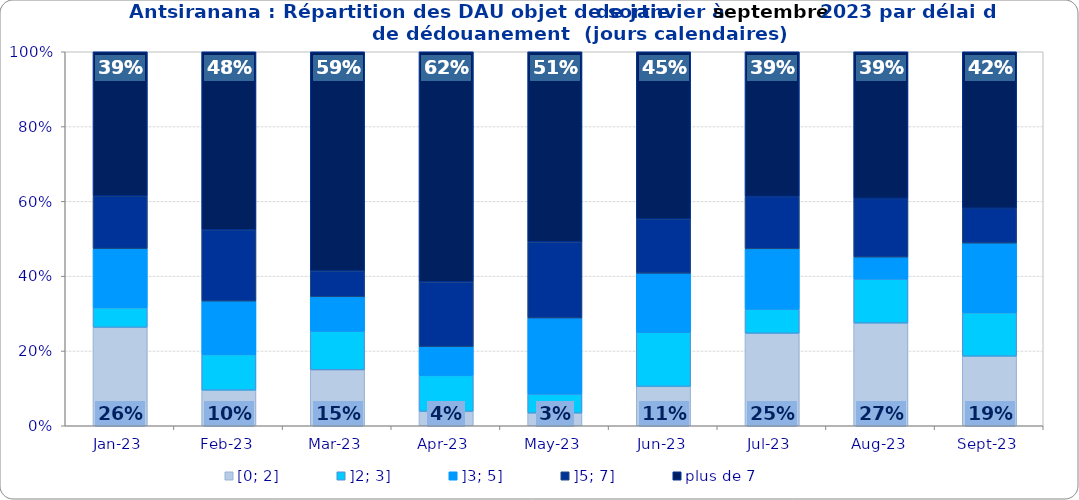
| Category | [0; 2] | ]2; 3] | ]3; 5] | ]5; 7] | plus de 7 |
|---|---|---|---|---|---|
| 2023-01-01 | 0.263 | 0.053 | 0.158 | 0.14 | 0.386 |
| 2023-02-01 | 0.095 | 0.095 | 0.143 | 0.19 | 0.476 |
| 2023-03-01 | 0.149 | 0.103 | 0.092 | 0.069 | 0.586 |
| 2023-04-01 | 0.038 | 0.096 | 0.077 | 0.173 | 0.615 |
| 2023-05-01 | 0.034 | 0.051 | 0.203 | 0.203 | 0.508 |
| 2023-06-01 | 0.105 | 0.145 | 0.158 | 0.145 | 0.447 |
| 2023-07-01 | 0.247 | 0.065 | 0.161 | 0.14 | 0.387 |
| 2023-08-01 | 0.275 | 0.118 | 0.059 | 0.157 | 0.392 |
| 2023-09-01 | 0.186 | 0.116 | 0.186 | 0.093 | 0.419 |